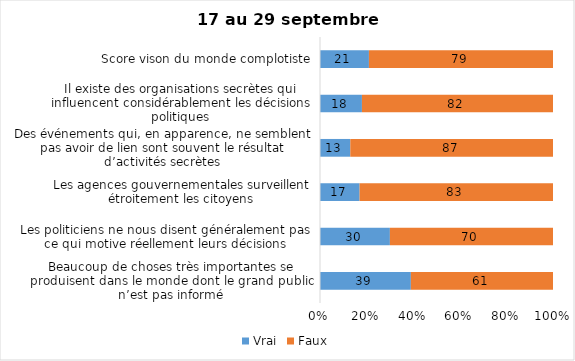
| Category | Vrai | Faux |
|---|---|---|
| Beaucoup de choses très importantes se produisent dans le monde dont le grand public n’est pas informé | 39 | 61 |
| Les politiciens ne nous disent généralement pas ce qui motive réellement leurs décisions | 30 | 70 |
| Les agences gouvernementales surveillent étroitement les citoyens | 17 | 83 |
| Des événements qui, en apparence, ne semblent pas avoir de lien sont souvent le résultat d’activités secrètes | 13 | 87 |
| Il existe des organisations secrètes qui influencent considérablement les décisions politiques | 18 | 82 |
| Score vison du monde complotiste | 21 | 79 |